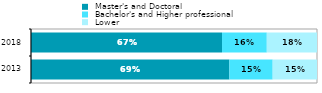
| Category |  Master's and Doctoral |  Bachelor's and Higher professional |  Lower |
|---|---|---|---|
| 2013.0 | 0.694 | 0.151 | 0.155 |
| 2018.0 | 0.668 | 0.157 | 0.176 |